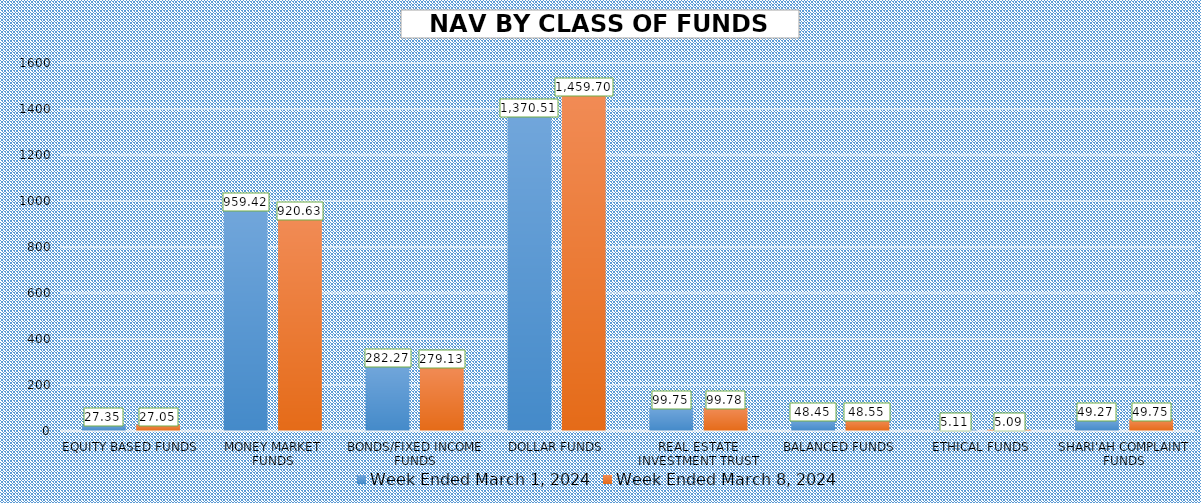
| Category | Week Ended March 1, 2024 | Week Ended March 8, 2024 |
|---|---|---|
| EQUITY BASED FUNDS | 27.345 | 27.05 |
| MONEY MARKET FUNDS | 959.42 | 920.626 |
| BONDS/FIXED INCOME FUNDS | 282.275 | 279.126 |
| DOLLAR FUNDS | 1370.514 | 1459.705 |
| REAL ESTATE INVESTMENT TRUST | 99.748 | 99.779 |
| BALANCED FUNDS | 48.445 | 48.553 |
| ETHICAL FUNDS | 5.112 | 5.09 |
| SHARI'AH COMPLAINT FUNDS | 49.268 | 49.747 |